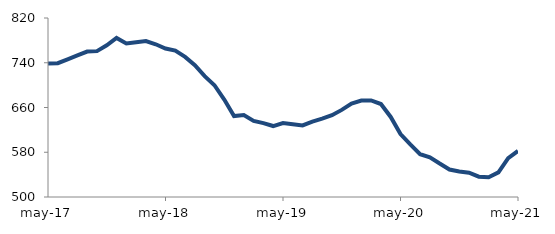
| Category | Series 0 |
|---|---|
| 2017-05-01 | 738.534 |
| 2017-06-01 | 739.156 |
| 2017-07-01 | 746.167 |
| 2017-08-01 | 753.171 |
| 2017-09-01 | 760.082 |
| 2017-10-01 | 760.759 |
| 2017-11-01 | 771.137 |
| 2017-12-01 | 784.243 |
| 2018-01-01 | 774.548 |
| 2018-02-01 | 776.834 |
| 2018-03-01 | 778.765 |
| 2018-04-01 | 773.022 |
| 2018-05-01 | 765.388 |
| 2018-06-01 | 761.611 |
| 2018-07-01 | 750.463 |
| 2018-08-01 | 735.626 |
| 2018-09-01 | 716.01 |
| 2018-10-01 | 699.844 |
| 2018-11-01 | 674.142 |
| 2018-12-01 | 644.616 |
| 2019-01-01 | 646.537 |
| 2019-02-01 | 636.077 |
| 2019-03-01 | 632.061 |
| 2019-04-01 | 626.854 |
| 2019-05-01 | 632.115 |
| 2019-06-01 | 630.023 |
| 2019-07-01 | 627.969 |
| 2019-08-01 | 634.691 |
| 2019-09-01 | 640.097 |
| 2019-10-01 | 646.299 |
| 2019-11-01 | 655.72 |
| 2019-12-01 | 667.143 |
| 2020-01-01 | 672.455 |
| 2020-02-01 | 672.659 |
| 2020-03-01 | 666.213 |
| 2020-04-01 | 643.099 |
| 2020-05-01 | 612.513 |
| 2020-06-01 | 594.105 |
| 2020-07-01 | 576.647 |
| 2020-08-01 | 570.999 |
| 2020-09-01 | 559.792 |
| 2020-10-01 | 549.14 |
| 2020-11-01 | 545.553 |
| 2020-12-01 | 543.546 |
| 2021-01-01 | 536.261 |
| 2021-02-01 | 535.415 |
| 2021-03-01 | 544.033 |
| 2021-04-01 | 569.495 |
| 2021-05-01 | 582.319 |